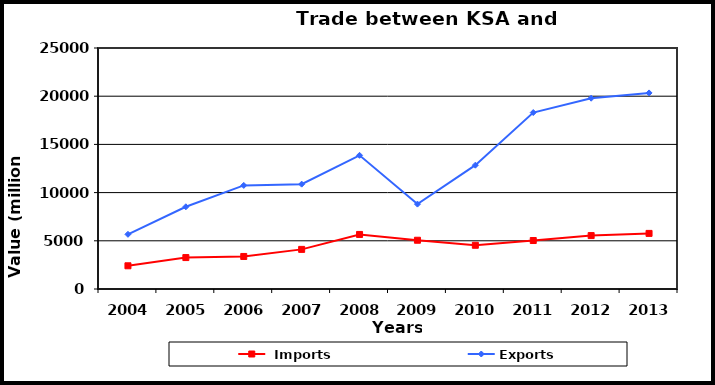
| Category |  Imports | Exports |
|---|---|---|
| 2004.0 | 2407 | 5673 |
| 2005.0 | 3261 | 8528 |
| 2006.0 | 3376 | 10746 |
| 2007.0 | 4109 | 10877 |
| 2008.0 | 5660 | 13867 |
| 2009.0 | 5058 | 8807 |
| 2010.0 | 4536 | 12845 |
| 2011.0 | 5028 | 18305 |
| 2012.0 | 5541 | 19793 |
| 2013.0 | 5767 | 20340 |